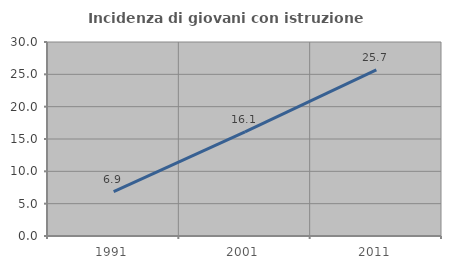
| Category | Incidenza di giovani con istruzione universitaria |
|---|---|
| 1991.0 | 6.878 |
| 2001.0 | 16.117 |
| 2011.0 | 25.698 |